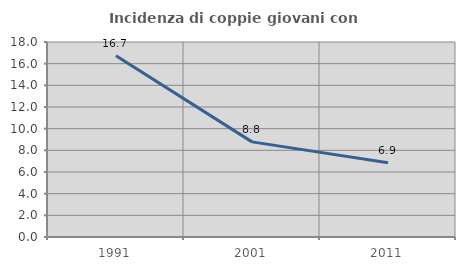
| Category | Incidenza di coppie giovani con figli |
|---|---|
| 1991.0 | 16.721 |
| 2001.0 | 8.779 |
| 2011.0 | 6.86 |